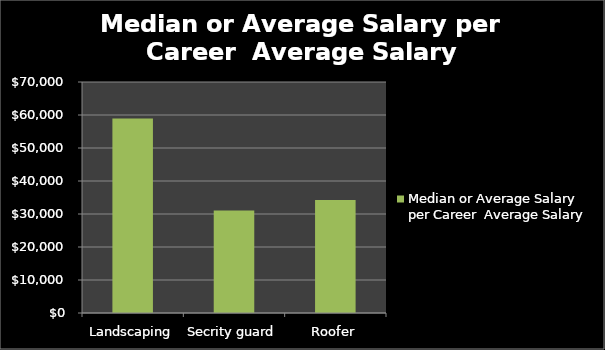
| Category | Median or Average Salary per Career Average Salary |
|---|---|
| Landscaping | 58960 |
| Secrity guard | 31030 |
| Roofer | 34211 |